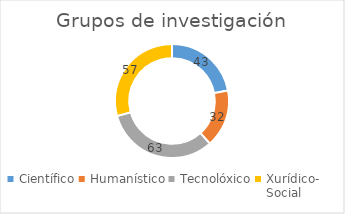
| Category | nº de grupos de investigación |
|---|---|
| Científico | 43 |
| Humanístico | 32 |
| Tecnolóxico | 63 |
| Xurídico-
Social | 57 |